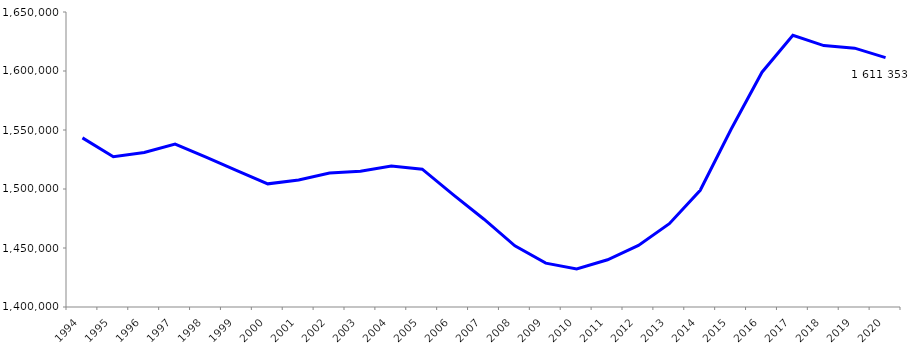
| Category | 1994 1995 1996 1997 1998 1999 2000 2001 2002 2003 2004 2005 2006 2007 2008 2009 2010 2011 2012 2013 2014 2015 2016 2017 2018 2019 2020 |
|---|---|
| 1994 | 1543322 |
| 1995 | 1527334 |
| 1996 | 1530893 |
| 1997 | 1538134 |
| 1998 | 1526911 |
| 1999 | 1515517 |
| 2000 | 1504359 |
| 2001 | 1507627 |
| 2002 | 1513602 |
| 2003 | 1515103 |
| 2004 | 1519460 |
| 2005 | 1516827 |
| 2006 | 1495220 |
| 2007 | 1474385 |
| 2008 | 1451806 |
| 2009 | 1437164 |
| 2010 | 1432195 |
| 2011 | 1440007 |
| 2012 | 1452155 |
| 2013 | 1470561 |
| 2014 | 1498897 |
| 2015 | 1550647 |
| 2016 | 1598985 |
| 2017 | 1630285 |
| 2018 | 1621551 |
| 2019 | 1619334 |
| 2020 | 1611353 |